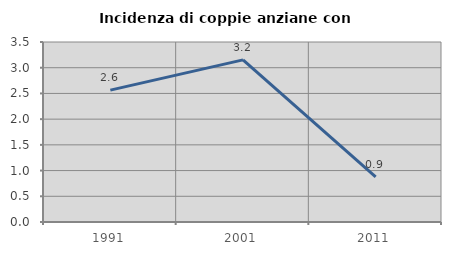
| Category | Incidenza di coppie anziane con figli |
|---|---|
| 1991.0 | 2.564 |
| 2001.0 | 3.153 |
| 2011.0 | 0.877 |